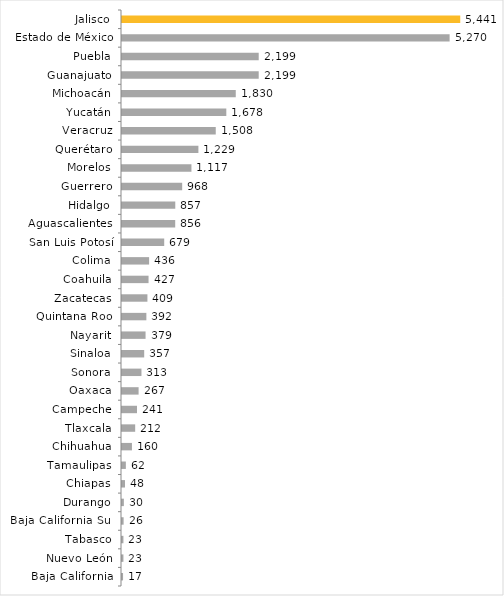
| Category | Producción de Carne en Canal |
|---|---|
| Baja California | 17 |
| Nuevo León | 23 |
| Tabasco | 23 |
| Baja California Sur | 26 |
| Durango | 30 |
| Chiapas | 48 |
| Tamaulipas | 62 |
| Chihuahua | 160 |
| Tlaxcala | 212 |
| Campeche | 241 |
| Oaxaca | 267 |
| Sonora | 313 |
| Sinaloa | 357 |
| Nayarit | 379 |
| Quintana Roo | 392 |
| Zacatecas | 409 |
| Coahuila | 427 |
| Colima | 436 |
| San Luis Potosí | 679 |
| Aguascalientes | 856 |
| Hidalgo | 857 |
| Guerrero | 968 |
| Morelos | 1117 |
| Querétaro | 1229 |
| Veracruz | 1508 |
| Yucatán | 1678 |
| Michoacán | 1830 |
| Guanajuato | 2199 |
| Puebla | 2199 |
| Estado de México | 5270 |
| Jalisco | 5441 |